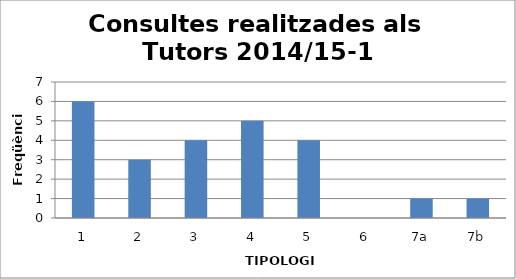
| Category | Series 0 |
|---|---|
| 1 | 6 |
| 2 | 3 |
| 3 | 4 |
| 4 | 5 |
| 5 | 4 |
| 6 | 0 |
| 7a | 1 |
| 7b | 1 |